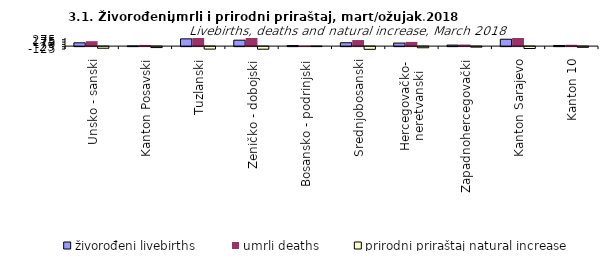
| Category | živorođeni livebirths | umrli deaths | prirodni priraštaj natural increase |
|---|---|---|---|
| Unsko - sanski | 142 | 213 | -71 |
| Kanton Posavski | 9 | 51 | -42 |
| Tuzlanski | 313 | 421 | -108 |
| Zeničko - dobojski | 256 | 368 | -112 |
| Bosansko - podrinjski | 22 | 20 | 2 |
| Srednjobosanski | 145 | 262 | -117 |
| Hercegovačko-
neretvanski | 131 | 181 | -50 |
| Zapadnohercegovački | 44 | 67 | -23 |
| Kanton Sarajevo | 297 | 430 | -133 |
| Kanton 10 | 27 | 58 | -31 |